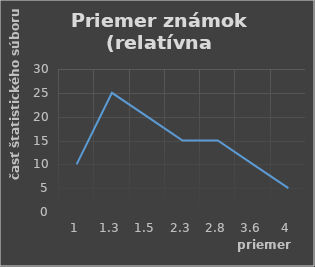
| Category | Series 0 |
|---|---|
| 1.0 | 10 |
| 1.3 | 25 |
| 1.5 | 20 |
| 2.3 | 15 |
| 2.8 | 15 |
| 3.6 | 10 |
| 4.0 | 5 |